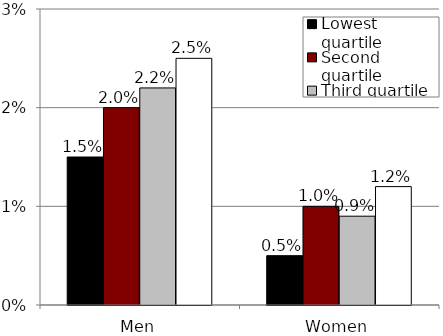
| Category | Lowest quartile | Second quartile | Third quartile | Highest quartile |
|---|---|---|---|---|
| Men | 0.015 | 0.02 | 0.022 | 0.025 |
| Women | 0.005 | 0.01 | 0.009 | 0.012 |